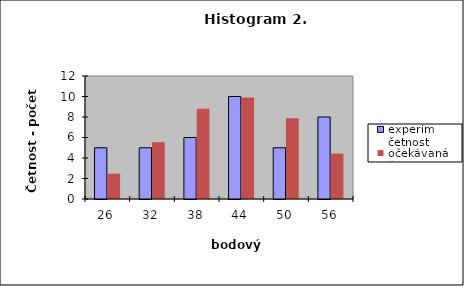
| Category | experim četnost | očekávaná četn |
|---|---|---|
| 26.0 | 5 | 2.47 |
| 32.0 | 5 | 5.543 |
| 38.0 | 6 | 8.802 |
| 44.0 | 10 | 9.891 |
| 50.0 | 5 | 7.867 |
| 56.0 | 8 | 4.428 |